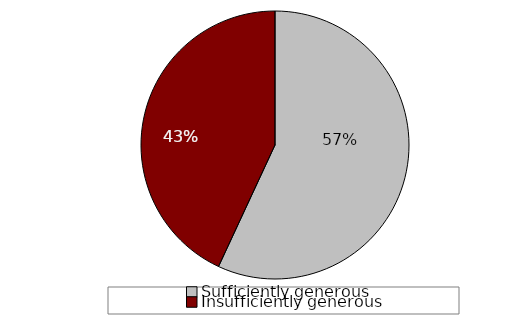
| Category | Series 0 |
|---|---|
| Sufficiently generous | 0.569 |
| Insufficiently generous | 0.431 |